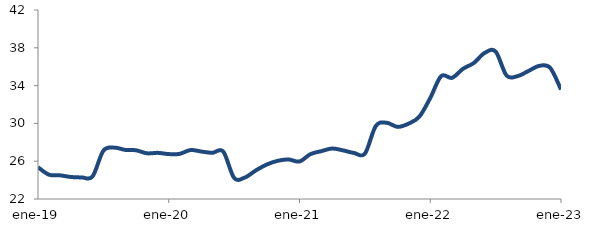
| Category | Series 0 |
|---|---|
| 2019-01-01 | 25.362 |
| 2019-02-01 | 24.576 |
| 2019-03-01 | 24.507 |
| 2019-04-01 | 24.332 |
| 2019-05-01 | 24.288 |
| 2019-06-01 | 24.38 |
| 2019-07-01 | 27.111 |
| 2019-08-01 | 27.436 |
| 2019-09-01 | 27.198 |
| 2019-10-01 | 27.153 |
| 2019-11-01 | 26.835 |
| 2019-12-01 | 26.883 |
| 2020-01-01 | 26.753 |
| 2020-02-01 | 26.779 |
| 2020-03-01 | 27.182 |
| 2020-04-01 | 27.02 |
| 2020-05-01 | 26.889 |
| 2020-06-01 | 27.021 |
| 2020-07-01 | 24.232 |
| 2020-08-01 | 24.283 |
| 2020-09-01 | 25.03 |
| 2020-10-01 | 25.653 |
| 2020-11-01 | 26.039 |
| 2020-12-01 | 26.183 |
| 2021-01-01 | 25.97 |
| 2021-02-01 | 26.744 |
| 2021-03-01 | 27.062 |
| 2021-04-01 | 27.342 |
| 2021-05-01 | 27.143 |
| 2021-06-01 | 26.873 |
| 2021-07-01 | 26.797 |
| 2021-08-01 | 29.718 |
| 2021-09-01 | 30.068 |
| 2021-10-01 | 29.632 |
| 2021-11-01 | 29.968 |
| 2021-12-01 | 30.718 |
| 2022-01-01 | 32.688 |
| 2022-02-01 | 35.003 |
| 2022-03-01 | 34.822 |
| 2022-04-01 | 35.773 |
| 2022-05-01 | 36.392 |
| 2022-06-01 | 37.464 |
| 2022-07-01 | 37.604 |
| 2022-08-01 | 35.071 |
| 2022-09-01 | 34.995 |
| 2022-10-01 | 35.539 |
| 2022-11-01 | 36.084 |
| 2022-12-01 | 35.887 |
| 2023-01-01 | 33.585 |